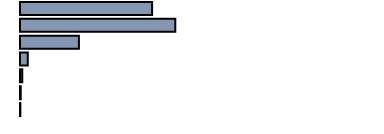
| Category | Series 0 |
|---|---|
| 0 | 37 |
| 1 | 43.5 |
| 2 | 16.5 |
| 3 | 2.2 |
| 4 | 0.6 |
| 5 | 0.2 |
| 6 | 0.1 |